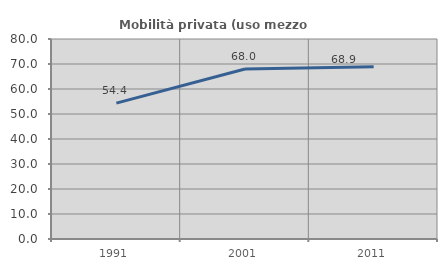
| Category | Mobilità privata (uso mezzo privato) |
|---|---|
| 1991.0 | 54.352 |
| 2001.0 | 68.024 |
| 2011.0 | 68.946 |